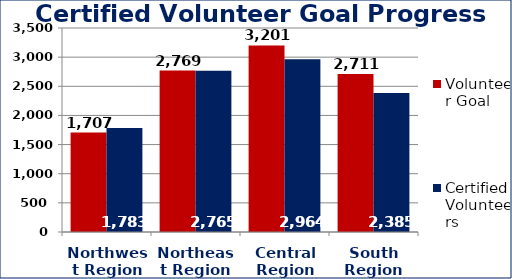
| Category | Volunteer Goal  | Certified Volunteers  |
|---|---|---|
| Northwest Region | 1707 | 1783 |
| Northeast Region | 2769 | 2765 |
| Central Region | 3201 | 2964 |
| South Region | 2711 | 2385 |